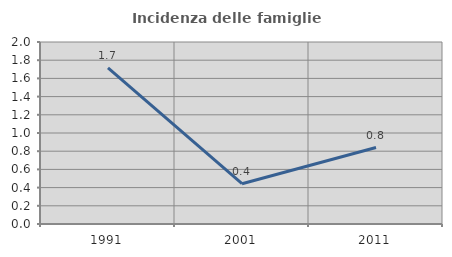
| Category | Incidenza delle famiglie numerose |
|---|---|
| 1991.0 | 1.717 |
| 2001.0 | 0.442 |
| 2011.0 | 0.84 |